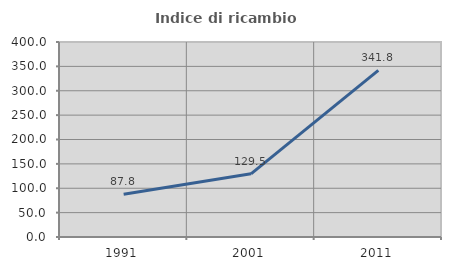
| Category | Indice di ricambio occupazionale  |
|---|---|
| 1991.0 | 87.831 |
| 2001.0 | 129.53 |
| 2011.0 | 341.758 |